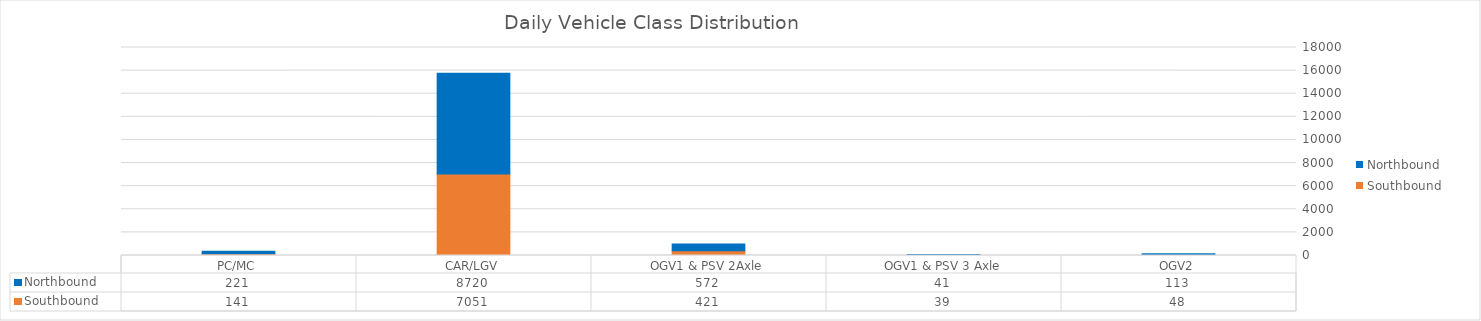
| Category | Southbound | Northbound |
|---|---|---|
| PC/MC | 141 | 221 |
| CAR/LGV | 7051 | 8720 |
| OGV1 & PSV 2Axle | 421 | 572 |
| OGV1 & PSV 3 Axle | 39 | 41 |
| OGV2 | 48 | 113 |